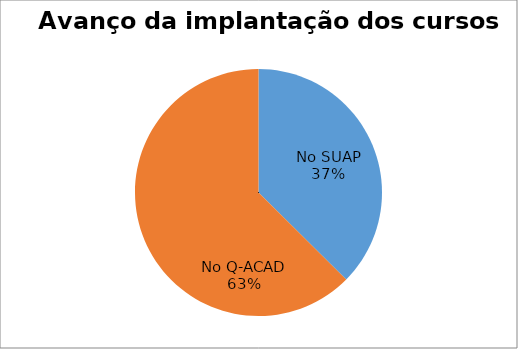
| Category | Series 0 |
|---|---|
| 0 | 64 |
| 1 | 107 |